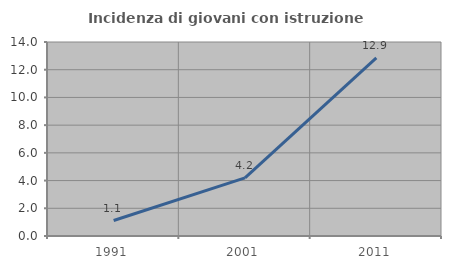
| Category | Incidenza di giovani con istruzione universitaria |
|---|---|
| 1991.0 | 1.117 |
| 2001.0 | 4.192 |
| 2011.0 | 12.857 |